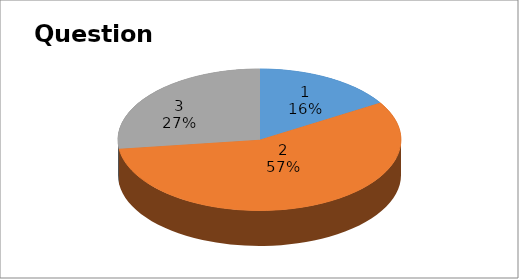
| Category | Series 0 |
|---|---|
| 0 | 6 |
| 1 | 21 |
| 2 | 10 |